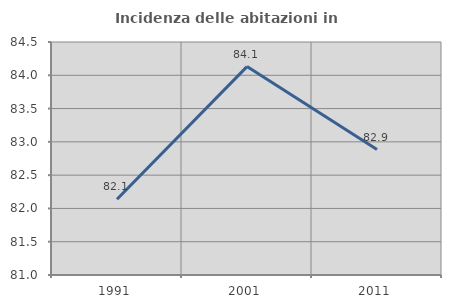
| Category | Incidenza delle abitazioni in proprietà  |
|---|---|
| 1991.0 | 82.139 |
| 2001.0 | 84.13 |
| 2011.0 | 82.884 |